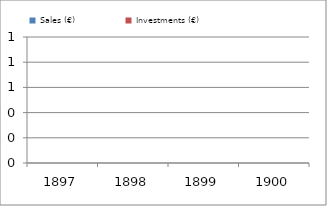
| Category | Sales (€) | Investments (€) |
|---|---|---|
| 1897.0 | 0 | 0 |
| 1898.0 | 0 | 0 |
| 1899.0 | 0 | 0 |
| 1900.0 | 0 | 0 |